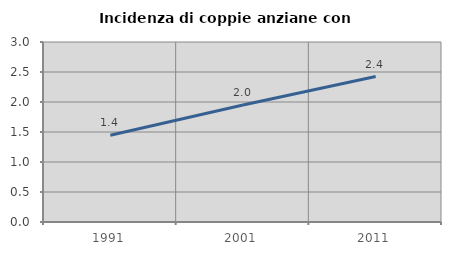
| Category | Incidenza di coppie anziane con figli |
|---|---|
| 1991.0 | 1.445 |
| 2001.0 | 1.951 |
| 2011.0 | 2.424 |